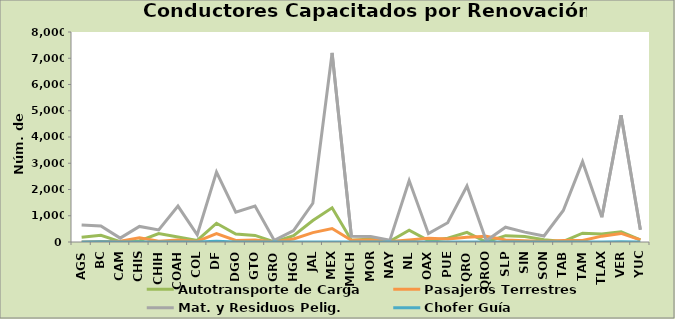
| Category | Autotransporte de Carga | Pasajeros Terrestres | Mat. y Residuos Pelig. | Chofer Guía |
|---|---|---|---|---|
| AGS | 184 | 0 | 646 | 0 |
| BC | 255 | 22 | 607 | 7 |
| CAM | 17 | 31 | 148 | 0 |
| CHIS | 42 | 158 | 594 | 0 |
| CHIH | 321 | 32 | 461 | 0 |
| COAH | 192 | 74 | 1369 | 0 |
| COL | 58 | 22 | 276 | 0 |
| DF | 715 | 321 | 2664 | 27 |
| DGO | 307 | 58 | 1139 | 0 |
| GTO | 251 | 78 | 1371 | 0 |
| GRO | 0 | 0 | 62 | 0 |
| HGO | 240 | 117 | 431 | 0 |
| JAL | 818 | 357 | 1476 | 3 |
| MEX | 1301 | 513 | 7202 | 0 |
| MICH | 65 | 68 | 220 | 0 |
| MOR | 114 | 79 | 206 | 0 |
| NAY | 29 | 20 | 71 | 0 |
| NL | 453 | 80 | 2340 | 0 |
| OAX | 52 | 146 | 318 | 0 |
| PUE | 143 | 114 | 733 | 0 |
| QRO | 367 | 178 | 2133 | 0 |
| QROO | 0 | 217 | 46 | 0 |
| SLP | 242 | 74 | 563 | 0 |
| SIN | 212 | 48 | 377 | 0 |
| SON | 90 | 20 | 228 | 0 |
| TAB | 21 | 60 | 1201 | 0 |
| TAM | 334 | 54 | 3061 | 0 |
| TLAX | 306 | 223 | 945 | 0 |
| VER | 390 | 327 | 4832 | 9 |
| YUC | 79 | 78 | 471 | 0 |